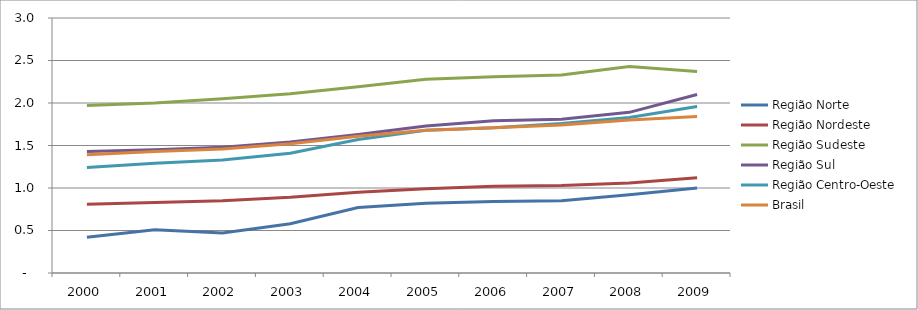
| Category | Região Norte | Região Nordeste | Região Sudeste | Região Sul | Região Centro-Oeste | Brasil |
|---|---|---|---|---|---|---|
| 2000.0 | 0.42 | 0.81 | 1.97 | 1.43 | 1.24 | 1.39 |
| 2001.0 | 0.51 | 0.83 | 2 | 1.45 | 1.29 | 1.43 |
| 2002.0 | 0.47 | 0.85 | 2.05 | 1.48 | 1.33 | 1.46 |
| 2003.0 | 0.58 | 0.89 | 2.11 | 1.54 | 1.41 | 1.52 |
| 2004.0 | 0.77 | 0.95 | 2.19 | 1.63 | 1.57 | 1.61 |
| 2005.0 | 0.82 | 0.99 | 2.28 | 1.73 | 1.68 | 1.68 |
| 2006.0 | 0.84 | 1.02 | 2.31 | 1.79 | 1.71 | 1.71 |
| 2007.0 | 0.85 | 1.03 | 2.33 | 1.81 | 1.76 | 1.74 |
| 2008.0 | 0.92 | 1.06 | 2.43 | 1.89 | 1.83 | 1.8 |
| 2009.0 | 1 | 1.12 | 2.37 | 2.1 | 1.96 | 1.84 |